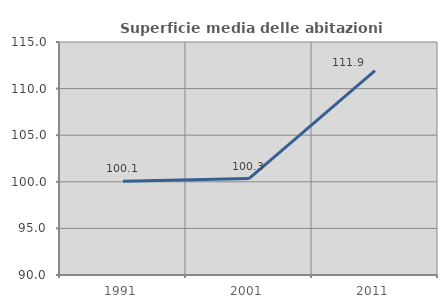
| Category | Superficie media delle abitazioni occupate |
|---|---|
| 1991.0 | 100.069 |
| 2001.0 | 100.349 |
| 2011.0 | 111.927 |